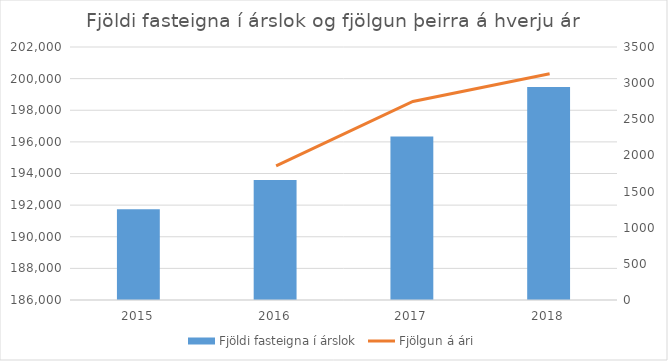
| Category | Fjöldi fasteigna í árslok |
|---|---|
| 2015.0 | 191738 |
| 2016.0 | 193593 |
| 2017.0 | 196340 |
| 2018.0 | 199470 |